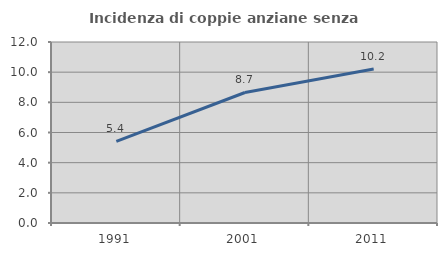
| Category | Incidenza di coppie anziane senza figli  |
|---|---|
| 1991.0 | 5.415 |
| 2001.0 | 8.653 |
| 2011.0 | 10.21 |